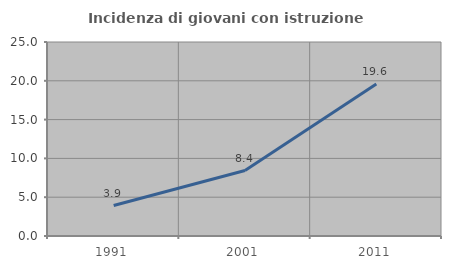
| Category | Incidenza di giovani con istruzione universitaria |
|---|---|
| 1991.0 | 3.93 |
| 2001.0 | 8.439 |
| 2011.0 | 19.588 |